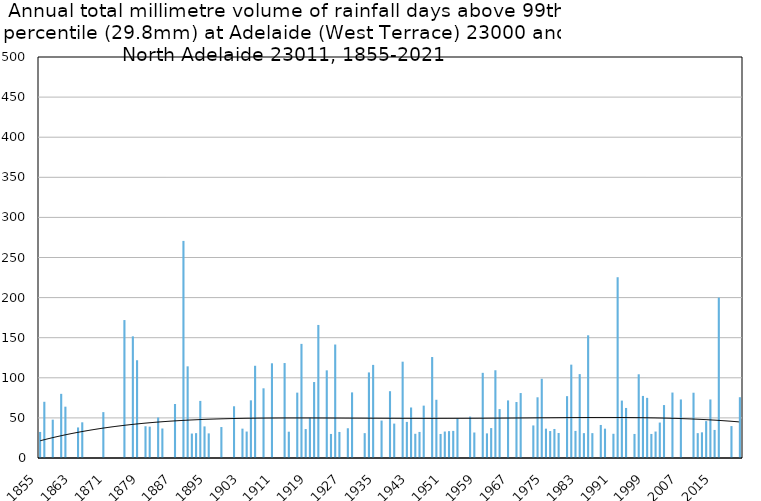
| Category | Annual total mm in days above 99th percentile |
|---|---|
| 1855 | 32.5 |
| 1856 | 70.1 |
| 1857 | 0 |
| 1858 | 47.8 |
| 1859 | 0 |
| 1860 | 80 |
| 1861 | 64 |
| 1862 | 0 |
| 1863 | 0 |
| 1864 | 38.1 |
| 1865 | 44.5 |
| 1866 | 0 |
| 1867 | 0 |
| 1868 | 0 |
| 1869 | 0 |
| 1870 | 57.2 |
| 1871 | 0 |
| 1872 | 0 |
| 1873 | 0 |
| 1874 | 0 |
| 1875 | 172 |
| 1876 | 0 |
| 1877 | 151.7 |
| 1878 | 121.9 |
| 1879 | 0 |
| 1880 | 39.6 |
| 1881 | 39.1 |
| 1882 | 0 |
| 1883 | 50.5 |
| 1884 | 36.8 |
| 1885 | 0 |
| 1886 | 0 |
| 1887 | 67.3 |
| 1888 | 0 |
| 1889 | 270.7 |
| 1890 | 114.3 |
| 1891 | 30.5 |
| 1892 | 31 |
| 1893 | 71.2 |
| 1894 | 39.4 |
| 1895 | 30.7 |
| 1896 | 0 |
| 1897 | 0 |
| 1898 | 38.6 |
| 1899 | 0 |
| 1900 | 0 |
| 1901 | 64.5 |
| 1902 | 0 |
| 1903 | 36.6 |
| 1904 | 33 |
| 1905 | 71.9 |
| 1906 | 115 |
| 1907 | 0 |
| 1908 | 86.9 |
| 1909 | 0 |
| 1910 | 118.1 |
| 1911 | 0 |
| 1912 | 0 |
| 1913 | 118.4 |
| 1914 | 32.8 |
| 1915 | 0 |
| 1916 | 81.5 |
| 1917 | 142.3 |
| 1918 | 36.1 |
| 1919 | 50.3 |
| 1920 | 94.7 |
| 1921 | 165.9 |
| 1922 | 0 |
| 1923 | 109.3 |
| 1924 | 30 |
| 1925 | 141.5 |
| 1926 | 32.5 |
| 1927 | 0 |
| 1928 | 37.1 |
| 1929 | 81.8 |
| 1930 | 0 |
| 1931 | 0 |
| 1932 | 31 |
| 1933 | 106.7 |
| 1934 | 116.1 |
| 1935 | 0 |
| 1936 | 46.7 |
| 1937 | 0 |
| 1938 | 83.3 |
| 1939 | 42.9 |
| 1940 | 0 |
| 1941 | 120.1 |
| 1942 | 45 |
| 1943 | 63 |
| 1944 | 30.2 |
| 1945 | 32.5 |
| 1946 | 65.3 |
| 1947 | 0 |
| 1948 | 125.9 |
| 1949 | 72.6 |
| 1950 | 30 |
| 1951 | 33 |
| 1952 | 33.5 |
| 1953 | 33.8 |
| 1954 | 49.3 |
| 1955 | 0 |
| 1956 | 0 |
| 1957 | 51.6 |
| 1958 | 31.8 |
| 1959 | 0 |
| 1960 | 106.2 |
| 1961 | 30.7 |
| 1962 | 37.3 |
| 1963 | 109.4 |
| 1964 | 61 |
| 1965 | 0 |
| 1966 | 71.8 |
| 1967 | 0 |
| 1968 | 69.8 |
| 1969 | 81 |
| 1970 | 0 |
| 1971 | 0 |
| 1972 | 40.6 |
| 1973 | 75.7 |
| 1974 | 98.8 |
| 1975 | 36.6 |
| 1976 | 33.6 |
| 1977 | 36.2 |
| 1978 | 31.2 |
| 1979 | 0 |
| 1980 | 77.1 |
| 1981 | 116.4 |
| 1982 | 33.8 |
| 1983 | 104.6 |
| 1984 | 31 |
| 1985 | 153 |
| 1986 | 31 |
| 1987 | 0 |
| 1988 | 41.2 |
| 1989 | 36.6 |
| 1990 | 0 |
| 1991 | 30.2 |
| 1992 | 225.4 |
| 1993 | 71.6 |
| 1994 | 62.4 |
| 1995 | 0 |
| 1996 | 30 |
| 1997 | 104.4 |
| 1998 | 77.4 |
| 1999 | 75 |
| 2000 | 30 |
| 2001 | 33 |
| 2002 | 44.2 |
| 2003 | 66 |
| 2004 | 0 |
| 2005 | 81.6 |
| 2006 | 0 |
| 2007 | 73 |
| 2008 | 0 |
| 2009 | 0 |
| 2010 | 81.4 |
| 2011 | 31 |
| 2012 | 32 |
| 2013 | 46 |
| 2014 | 73 |
| 2015 | 35 |
| 2016 | 200 |
| 2017 | 0 |
| 2018 | 0 |
| 2019 | 39.8 |
| 2020 | 0 |
| 2021 | 75.8 |